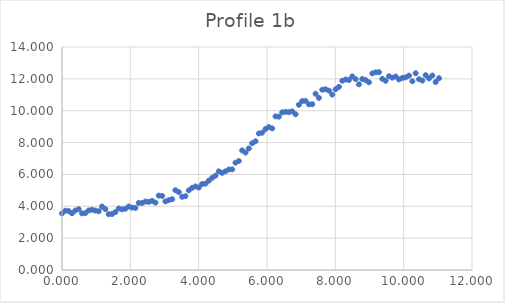
| Category | Series 0 |
|---|---|
| 0.0 | 3.553 |
| 0.09765625 | 3.721 |
| 0.1953125 | 3.699 |
| 0.29296875 | 3.56 |
| 0.390625 | 3.734 |
| 0.48828125 | 3.822 |
| 0.5859375 | 3.558 |
| 0.68359375 | 3.576 |
| 0.78125 | 3.741 |
| 0.87890625 | 3.783 |
| 0.9765625 | 3.731 |
| 1.07421875 | 3.688 |
| 1.171875 | 3.984 |
| 1.26953125 | 3.823 |
| 1.3671875 | 3.505 |
| 1.46484375 | 3.514 |
| 1.5625 | 3.634 |
| 1.66015625 | 3.863 |
| 1.7578125 | 3.81 |
| 1.85546875 | 3.848 |
| 1.953125 | 3.987 |
| 2.05078125 | 3.919 |
| 2.1484375 | 3.893 |
| 2.24609375 | 4.212 |
| 2.34375 | 4.204 |
| 2.44140625 | 4.296 |
| 2.5390625 | 4.278 |
| 2.63671875 | 4.337 |
| 2.734375 | 4.23 |
| 2.83203125 | 4.668 |
| 2.9296875 | 4.651 |
| 3.02734375 | 4.306 |
| 3.125 | 4.385 |
| 3.22265625 | 4.444 |
| 3.3203125 | 5.008 |
| 3.41796875 | 4.893 |
| 3.515625 | 4.595 |
| 3.61328125 | 4.636 |
| 3.7109375 | 5.002 |
| 3.80859375 | 5.157 |
| 3.90625 | 5.246 |
| 4.00390625 | 5.179 |
| 4.1015625 | 5.398 |
| 4.19921875 | 5.42 |
| 4.296875 | 5.605 |
| 4.39453125 | 5.787 |
| 4.4921875 | 5.922 |
| 4.58984375 | 6.191 |
| 4.6875 | 6.098 |
| 4.78515625 | 6.193 |
| 4.8828125 | 6.31 |
| 4.98046875 | 6.318 |
| 5.078125 | 6.736 |
| 5.17578125 | 6.84 |
| 5.2734375 | 7.509 |
| 5.37109375 | 7.373 |
| 5.46875 | 7.629 |
| 5.56640625 | 7.957 |
| 5.6640625 | 8.081 |
| 5.76171875 | 8.574 |
| 5.859375 | 8.619 |
| 5.95703125 | 8.85 |
| 6.0546875 | 8.973 |
| 6.15234375 | 8.889 |
| 6.25 | 9.643 |
| 6.34765625 | 9.626 |
| 6.4453125 | 9.898 |
| 6.54296875 | 9.928 |
| 6.640625 | 9.909 |
| 6.73828125 | 9.96 |
| 6.8359375 | 9.777 |
| 6.93359375 | 10.371 |
| 7.03125 | 10.606 |
| 7.12890625 | 10.616 |
| 7.2265625 | 10.401 |
| 7.32421875 | 10.408 |
| 7.421875 | 11.063 |
| 7.51953125 | 10.805 |
| 7.6171875 | 11.317 |
| 7.71484375 | 11.346 |
| 7.8125 | 11.259 |
| 7.91015625 | 11.013 |
| 8.0078125 | 11.347 |
| 8.10546875 | 11.497 |
| 8.203125 | 11.885 |
| 8.30078125 | 11.958 |
| 8.3984375 | 11.926 |
| 8.49609375 | 12.155 |
| 8.59375 | 11.981 |
| 8.69140625 | 11.659 |
| 8.7890625 | 11.988 |
| 8.88671875 | 11.923 |
| 8.984375 | 11.784 |
| 9.08203125 | 12.342 |
| 9.1796875 | 12.408 |
| 9.27734375 | 12.42 |
| 9.375 | 12.001 |
| 9.47265625 | 11.879 |
| 9.5703125 | 12.165 |
| 9.66796875 | 12.073 |
| 9.765625 | 12.145 |
| 9.86328125 | 11.963 |
| 9.9609375 | 12.057 |
| 10.05859375 | 12.094 |
| 10.15625 | 12.201 |
| 10.25390625 | 11.848 |
| 10.3515625 | 12.352 |
| 10.44921875 | 11.978 |
| 10.546875 | 11.893 |
| 10.64453125 | 12.23 |
| 10.7421875 | 12.026 |
| 10.83984375 | 12.207 |
| 10.9375 | 11.802 |
| 11.03515625 | 12.043 |